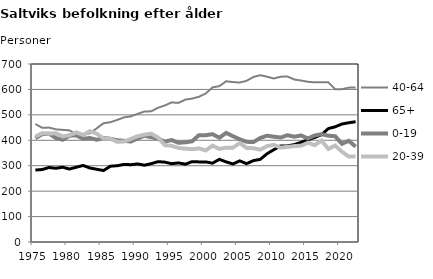
| Category | 40-64 | 65+ | 0-19 | 20-39 |
|---|---|---|---|---|
| 1975.0 | 464 | 283 | 408 | 415 |
| 1976.0 | 449 | 285 | 424 | 428 |
| 1977.0 | 450 | 293 | 426 | 426 |
| 1978.0 | 443 | 290 | 409 | 428 |
| 1979.0 | 441 | 294 | 402 | 415 |
| 1980.0 | 439 | 287 | 418 | 420 |
| 1981.0 | 424 | 294 | 419 | 431 |
| 1982.0 | 420 | 301 | 406 | 421 |
| 1983.0 | 428 | 291 | 409 | 436 |
| 1984.0 | 447 | 286 | 402 | 426 |
| 1985.0 | 467 | 281 | 409 | 407 |
| 1986.0 | 471 | 298 | 406 | 406 |
| 1987.0 | 480 | 300 | 400 | 394 |
| 1988.0 | 490 | 305 | 398 | 395 |
| 1989.0 | 494 | 304 | 395 | 405 |
| 1990.0 | 504 | 307 | 407 | 416 |
| 1991.0 | 513 | 302 | 418 | 422 |
| 1992.0 | 514 | 308 | 412 | 426 |
| 1993.0 | 528 | 316 | 406 | 411 |
| 1994.0 | 537 | 314 | 395 | 381 |
| 1995.0 | 549 | 308 | 401 | 378 |
| 1996.0 | 547 | 311 | 390 | 370 |
| 1997.0 | 560 | 306 | 392 | 367 |
| 1998.0 | 564 | 316 | 396 | 365 |
| 1999.0 | 571 | 315 | 420 | 368 |
| 2000.0 | 584 | 315 | 420 | 360 |
| 2001.0 | 608 | 310 | 424 | 379 |
| 2002.0 | 613 | 325 | 410 | 366 |
| 2003.0 | 632 | 315 | 429 | 371 |
| 2004.0 | 629 | 307 | 416 | 371 |
| 2005.0 | 627 | 319 | 404 | 389 |
| 2006.0 | 634 | 308 | 394 | 370 |
| 2007.0 | 649 | 320 | 393 | 369 |
| 2008.0 | 656 | 325 | 409 | 363 |
| 2009.0 | 650 | 347 | 418 | 377 |
| 2010.0 | 643 | 363 | 414 | 382 |
| 2011.0 | 650 | 378 | 411 | 371 |
| 2012.0 | 651 | 378 | 420 | 374 |
| 2013.0 | 639 | 383 | 414 | 377 |
| 2014.0 | 635 | 392 | 419 | 379 |
| 2015.0 | 630 | 402 | 407 | 390 |
| 2016.0 | 628 | 411 | 419 | 381 |
| 2017.0 | 628 | 422 | 424 | 399 |
| 2018.0 | 628 | 446 | 418 | 366 |
| 2019.0 | 601 | 453 | 416 | 379 |
| 2020.0 | 601 | 464 | 386 | 355 |
| 2021.0 | 607 | 469 | 398 | 336 |
| 2022.0 | 608 | 473 | 375 | 337 |